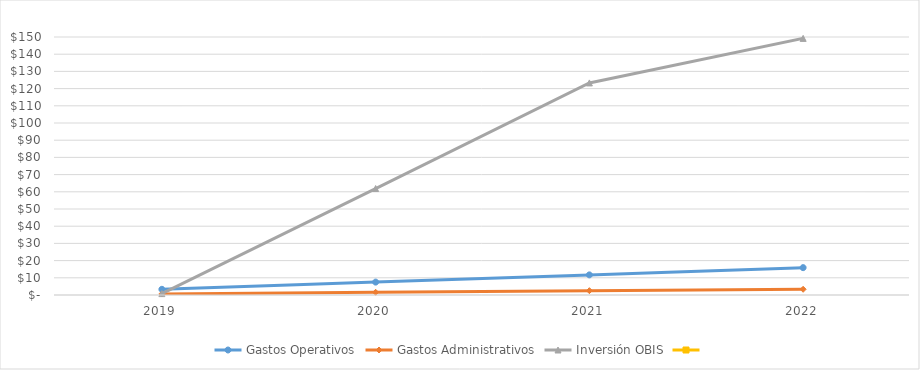
| Category | Gastos Operativos | Gastos Administrativos | Inversión OBIS | Series 3 |
|---|---|---|---|---|
| 2019.0 | 3.3 | 0.6 | 0.8 |  |
| 2020.0 | 7.5 | 1.58 | 61.9 |  |
| 2021.0 | 11.7 | 2.52 | 123.3 |  |
| 2022.0 | 15.9 | 3.33 | 149.2 |  |